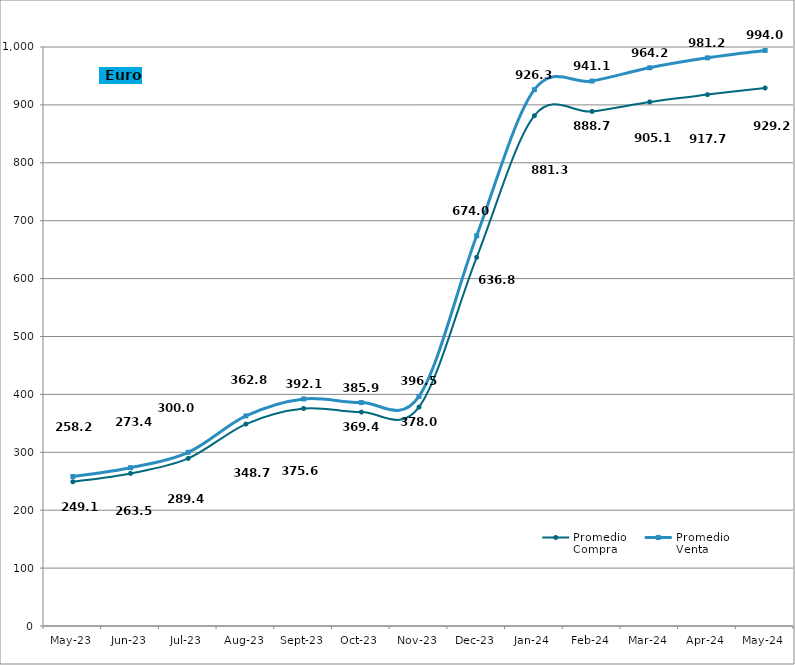
| Category | Promedio
Compra  | Promedio
Venta |
|---|---|---|
| 2023-05-01 | 249.126 | 258.248 |
| 2023-06-01 | 263.5 | 273.471 |
| 2023-07-01 | 289.467 | 300.025 |
| 2023-08-01 | 348.76 | 362.82 |
| 2023-09-01 | 375.65 | 392.125 |
| 2023-10-01 | 369.444 | 385.919 |
| 2023-11-01 | 378.072 | 396.531 |
| 2023-12-01 | 636.835 | 674.037 |
| 2024-01-01 | 881.34 | 926.34 |
| 2024-02-01 | 888.71 | 941.176 |
| 2024-03-01 | 905.157 | 964.2 |
| 2024-04-01 | 917.768 | 981.27 |
| 2024-05-01 | 929.205 | 994.061 |